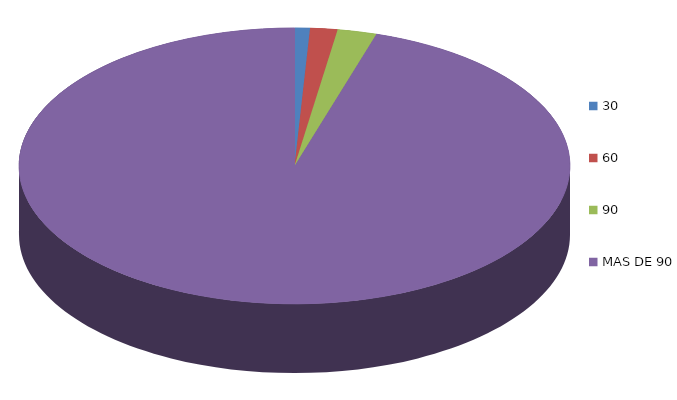
| Category | Series 0 | 341,501.7 |
|---|---|---|
| 30 | 341501.7 |  |
| 60 | 607114 |  |
| 90 | 872726.5 |  |
| MAS DE 90 | 36123287.5 |  |